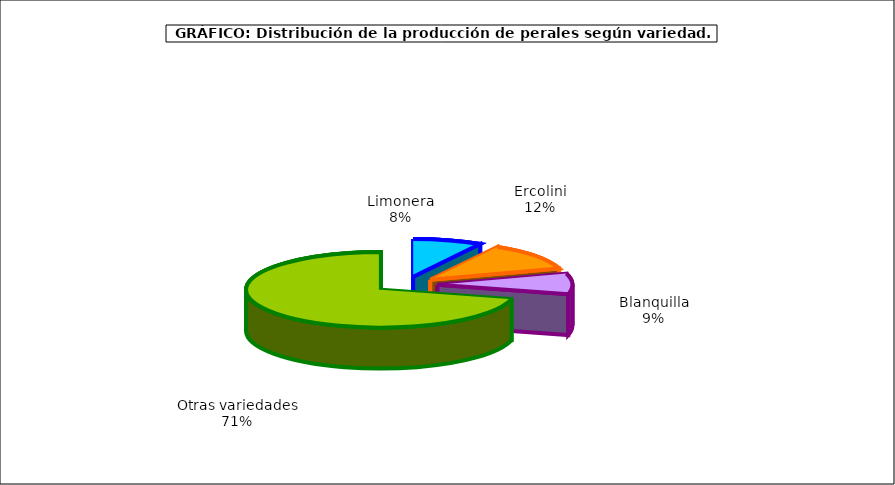
| Category | produccion |
|---|---|
| 0 | 20.597 |
| 1 | 29.681 |
| 2 | 21.896 |
| 3 | 176.8 |